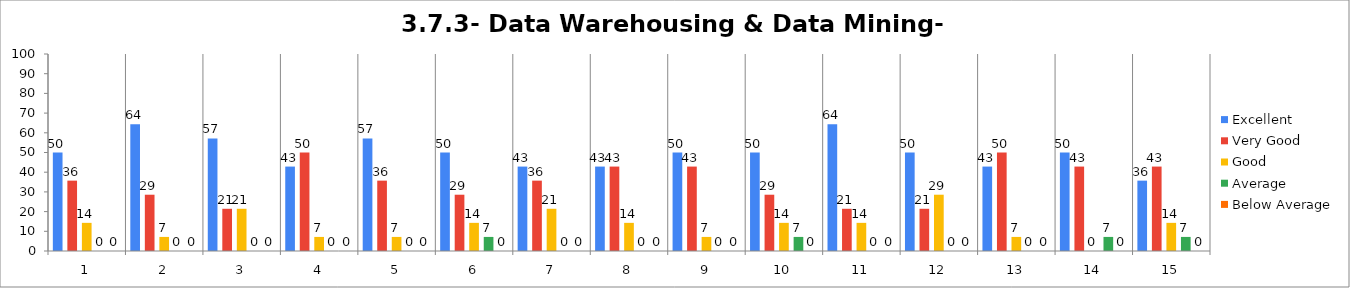
| Category | Excellent | Very Good | Good | Average | Below Average |
|---|---|---|---|---|---|
| 0 | 50 | 35.714 | 14.286 | 0 | 0 |
| 1 | 64.286 | 28.571 | 7.143 | 0 | 0 |
| 2 | 57.143 | 21.429 | 21.429 | 0 | 0 |
| 3 | 42.857 | 50 | 7.143 | 0 | 0 |
| 4 | 57.143 | 35.714 | 7.143 | 0 | 0 |
| 5 | 50 | 28.571 | 14.286 | 7.143 | 0 |
| 6 | 42.857 | 35.714 | 21.429 | 0 | 0 |
| 7 | 42.857 | 42.857 | 14.286 | 0 | 0 |
| 8 | 50 | 42.857 | 7.143 | 0 | 0 |
| 9 | 50 | 28.571 | 14.286 | 7.143 | 0 |
| 10 | 64.286 | 21.429 | 14.286 | 0 | 0 |
| 11 | 50 | 21.429 | 28.571 | 0 | 0 |
| 12 | 42.857 | 50 | 7.143 | 0 | 0 |
| 13 | 50 | 42.857 | 0 | 7.143 | 0 |
| 14 | 35.714 | 42.857 | 14.286 | 7.143 | 0 |